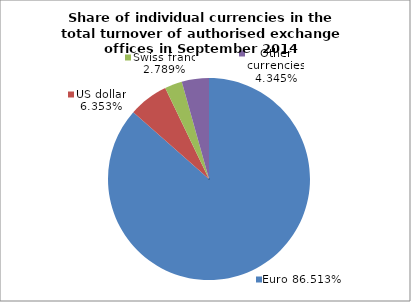
| Category | EUR |
|---|---|
| 0 | 0.865 |
| 1 | 0.064 |
| 2 | 0.028 |
| 3 | 0.043 |